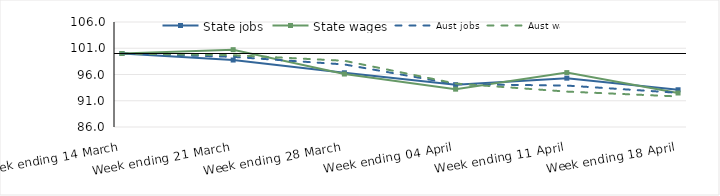
| Category | State jobs | State wages | Aust jobs | Aust wages |
|---|---|---|---|---|
| 2020-03-14 | 100 | 100 | 100 | 100 |
| 2020-03-21 | 98.757 | 100.73 | 99.358 | 99.683 |
| 2020-03-28 | 96.326 | 96.092 | 97.912 | 98.613 |
| 2020-04-04 | 94.067 | 93.207 | 94.152 | 94.278 |
| 2020-04-11 | 95.302 | 96.36 | 93.892 | 92.743 |
| 2020-04-18 | 93.093 | 92.475 | 92.512 | 91.82 |